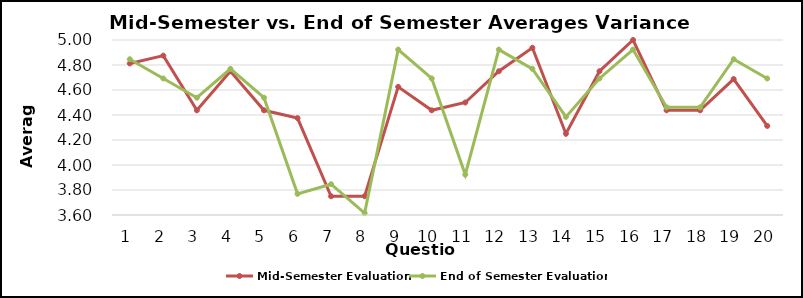
| Category | Mid-Semester Evaluation | End of Semester Evaluation |
|---|---|---|
| 0 | 4.812 | 4.846 |
| 1 | 4.875 | 4.692 |
| 2 | 4.438 | 4.538 |
| 3 | 4.75 | 4.769 |
| 4 | 4.438 | 4.538 |
| 5 | 4.375 | 3.769 |
| 6 | 3.75 | 3.846 |
| 7 | 3.75 | 3.615 |
| 8 | 4.625 | 4.923 |
| 9 | 4.438 | 4.692 |
| 10 | 4.5 | 3.923 |
| 11 | 4.75 | 4.923 |
| 12 | 4.938 | 4.769 |
| 13 | 4.25 | 4.385 |
| 14 | 4.75 | 4.692 |
| 15 | 5 | 4.923 |
| 16 | 4.438 | 4.462 |
| 17 | 4.438 | 4.462 |
| 18 | 4.688 | 4.846 |
| 19 | 4.312 | 4.692 |